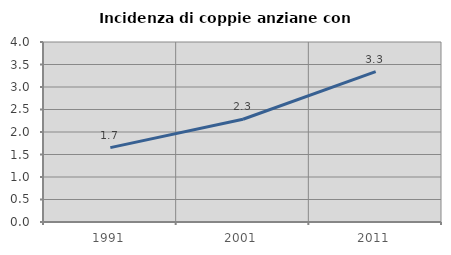
| Category | Incidenza di coppie anziane con figli |
|---|---|
| 1991.0 | 1.653 |
| 2001.0 | 2.283 |
| 2011.0 | 3.343 |